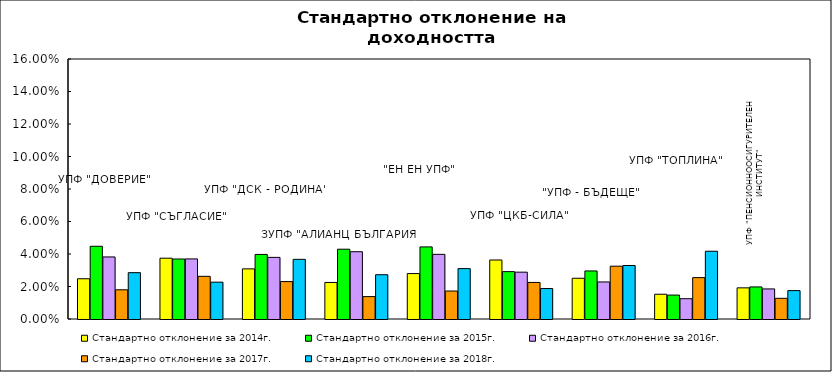
| Category | Стандартно отклонение за 2014г. | Стандартно отклонение за 2015г. | Стандартно отклонение за 2016г. | Стандартно отклонение за 2017г. | Стандартно отклонение за 2018г. |
|---|---|---|---|---|---|
| УПФ "ДОВЕРИЕ"  | 0.025 | 0.045 | 0.038 | 0.018 | 0.029 |
| УПФ "СЪГЛАСИЕ" | 0.037 | 0.037 | 0.037 | 0.026 | 0.023 |
| УПФ "ДСК - РОДИНА" | 0.031 | 0.04 | 0.038 | 0.023 | 0.037 |
| ЗУПФ "АЛИАНЦ БЪЛГАРИЯ" | 0.022 | 0.043 | 0.041 | 0.014 | 0.027 |
| "ЕН ЕН УПФ" | 0.028 | 0.044 | 0.04 | 0.017 | 0.031 |
| УПФ "ЦКБ-СИЛА" | 0.036 | 0.029 | 0.029 | 0.022 | 0.019 |
| "УПФ - БЪДЕЩЕ" | 0.025 | 0.03 | 0.023 | 0.032 | 0.033 |
| УПФ "ТОПЛИНА" | 0.015 | 0.015 | 0.012 | 0.025 | 0.042 |
| УПФ "ПЕНСИОННООСИГУРИТЕЛЕН ИНСТИТУТ" | 0.019 | 0.02 | 0.019 | 0.013 | 0.017 |